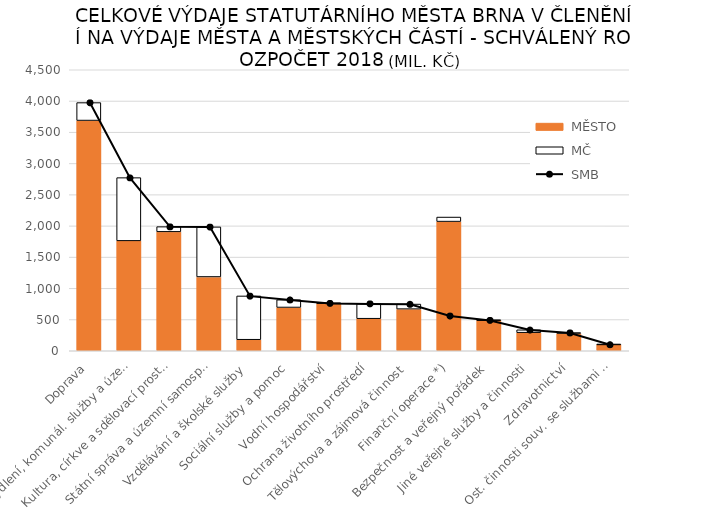
| Category |  MĚSTO |  MČ |
|---|---|---|
|  Doprava | 3686.674 | 287.623 |
|  Bydlení, komunál. služby a územní rozvoj | 1760.012 | 1012.588 |
|  Kultura, církve a sdělovací prostředky | 1904.206 | 83.719 |
|  Státní správa a územní samospráva | 1181.931 | 802.034 |
|  Vzdělávání a školské služby | 176.794 | 701.204 |
|  Sociální služby a pomoc | 693.028 | 124.341 |
|  Vodní hospodářství | 761.005 | 0.972 |
|  Ochrana životního prostředí | 513.412 | 241.23 |
|  Tělovýchova a zájmová činnost | 666.837 | 80.986 |
|  Finanční operace *) | 2068.478 | 72.904 |
|  Bezpečnost a veřejný pořádek | 488.931 | 0.87 |
|  Jiné veřejné služby a činnosti | 289.462 | 46.31 |
|  Zdravotnictví | 278.309 | 10.921 |
|  Ost. činnosti souv. se službami pro obyv. | 100.574 | 0.4 |